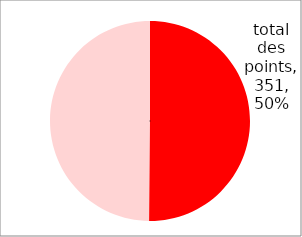
| Category | Series 0 |
|---|---|
| total des points | 351 |
| points manquants | 349 |